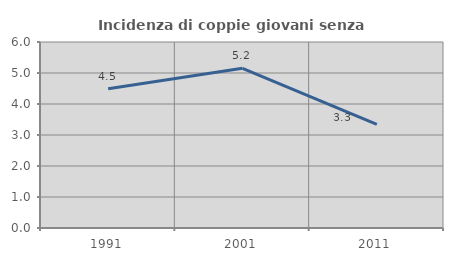
| Category | Incidenza di coppie giovani senza figli |
|---|---|
| 1991.0 | 4.491 |
| 2001.0 | 5.15 |
| 2011.0 | 3.345 |